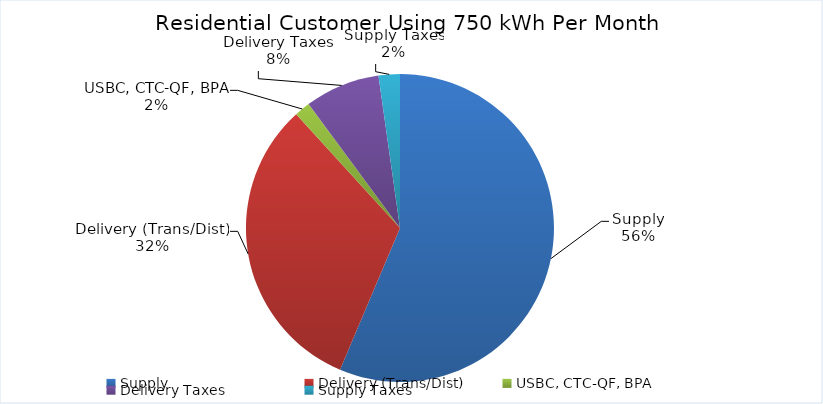
| Category | Series 0 |
|---|---|
| Supply | 63.06 |
| Delivery (Trans/Dist) | 35.64 |
| USBC, CTC-QF, BPA | 1.85 |
| Delivery Taxes | 8.82 |
| Supply Taxes | 2.5 |